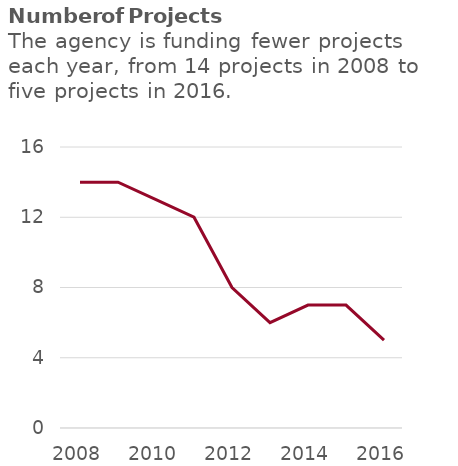
| Category | Number of Projects Funded |
|---|---|
| 2008.0 | 14 |
| 2009.0 | 14 |
| 2010.0 | 13 |
| 2011.0 | 12 |
| 2012.0 | 8 |
| 2013.0 | 6 |
| 2014.0 | 7 |
| 2015.0 | 7 |
| 2016.0 | 5 |